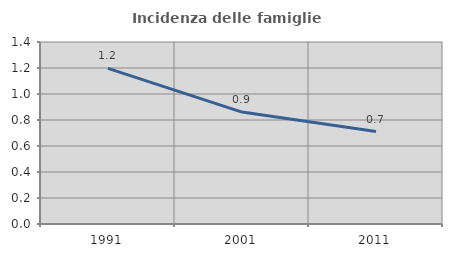
| Category | Incidenza delle famiglie numerose |
|---|---|
| 1991.0 | 1.197 |
| 2001.0 | 0.861 |
| 2011.0 | 0.711 |